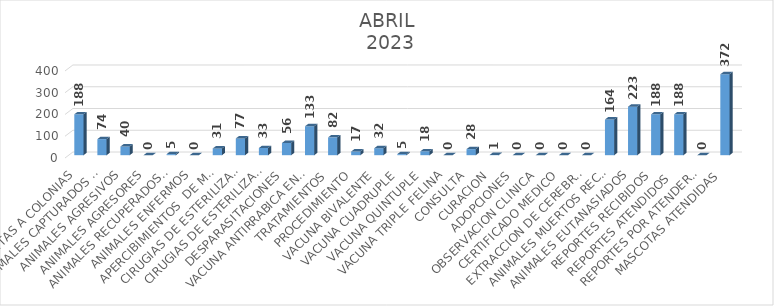
| Category | Series 0 |
|---|---|
| VISITAS A COLONIAS | 188 |
| ANIMALES CAPTURADOS PERROS Y GATOS  | 74 |
| ANIMALES AGRESIVOS | 40 |
| ANIMALES AGRESORES | 0 |
| ANIMALES RECUPERADOS POR SUS DUEÑOS | 5 |
| ANIMALES ENFERMOS | 0 |
| APERCIBIMIENTOS  DE MALTRATO ANIMAL | 31 |
| CIRUGIAS DE ESTERILIZACION (OVH) hembra | 77 |
| CIRUGIAS DE ESTERILIZACION (ORQ) macho | 33 |
| DESPARASITACIONES | 56 |
| VACUNA ANTIRRABICA EN OFICINA Y CAMPAÑAS  | 133 |
| TRATAMIENTOS | 82 |
| PROCEDIMIENTO | 17 |
| VACUNA BIVALENTE | 32 |
| VACUNA CUADRUPLE | 5 |
| VACUNA QUINTUPLE | 18 |
| VACUNA TRIPLE FELINA | 0 |
| CONSULTA | 28 |
| CURACION | 1 |
| ADOPCIONES | 0 |
| OBSERVACION CLINICA | 0 |
| CERTIFICADO MEDICO | 0 |
| EXTRACCION DE CEREBROS | 0 |
| ANIMALES MUERTOS RECOLECTADOS | 164 |
| ANIMALES EUTANASIADOS | 223 |
| REPORTES RECIBIDOS | 188 |
| REPORTES ATENDIDOS  | 188 |
| REPORTES POR ATENDER (PENDIENTES) | 0 |
| MASCOTAS ATENDIDAS | 372 |